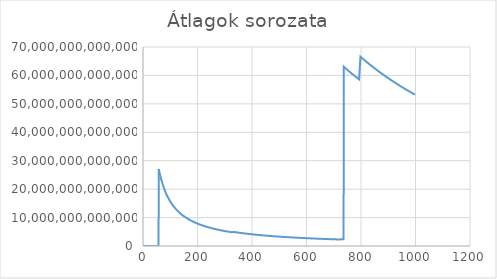
| Category | Series 0 |
|---|---|
| 1.0 | 1.416 |
| 2.0 | 37.728 |
| 3.0 | 2024.991 |
| 4.0 | 1519.695 |
| 5.0 | 1216.106 |
| 6.0 | 2489.924 |
| 7.0 | 2134.746 |
| 8.0 | 1868.083 |
| 9.0 | 1661.159 |
| 10.0 | 1520.624 |
| 11.0 | 555555.229 |
| 12.0 | 509259.933 |
| 13.0 | 470086.574 |
| 14.0 | 437006.24 |
| 15.0 | 407872.583 |
| 16.0 | 382380.632 |
| 17.0 | 359887.732 |
| 18.0 | 1021468.483 |
| 19.0 | 967707.048 |
| 20.0 | 919369.54 |
| 21.0 | 875650.569 |
| 22.0 | 835848.643 |
| 23.0 | 799507.969 |
| 24.0 | 766195.199 |
| 25.0 | 735547.872 |
| 26.0 | 713370.407 |
| 27.0 | 686949.419 |
| 28.0 | 662415.551 |
| 29.0 | 639574.191 |
| 30.0 | 618255.143 |
| 31.0 | 598313.067 |
| 32.0 | 579618.961 |
| 33.0 | 562054.81 |
| 34.0 | 545523.862 |
| 35.0 | 529937.576 |
| 36.0 | 515496.028 |
| 37.0 | 501783.998 |
| 38.0 | 488579.184 |
| 39.0 | 4834120.02 |
| 40.0 | 4713267.061 |
| 41.0 | 4598309.36 |
| 42.0 | 4488825.901 |
| 43.0 | 4384435.829 |
| 44.0 | 4284789.987 |
| 45.0 | 4190022.595 |
| 46.0 | 4099157.76 |
| 47.0 | 4013479.16 |
| 48.0 | 3929865.741 |
| 49.0 | 3849682.39 |
| 50.0 | 3772721.393 |
| 51.0 | 3698765.029 |
| 52.0 | 3627635.266 |
| 53.0 | 3559189.375 |
| 54.0 | 3493278.483 |
| 55.0 | 3429769.534 |
| 56.0 | 3368523.748 |
| 57.0 | 3309426.86 |
| 58.0 | 27010491802150.08 |
| 59.0 | 26552686856388.28 |
| 60.0 | 26110142075473.062 |
| 61.0 | 25682106959487.42 |
| 62.0 | 25267879427882.824 |
| 63.0 | 24866802155581.01 |
| 64.0 | 24478258371900.086 |
| 65.0 | 24101669824731.645 |
| 66.0 | 23736493009205.508 |
| 67.0 | 23382216994142.863 |
| 68.0 | 23038360861876.105 |
| 69.0 | 22704471574022.844 |
| 70.0 | 22380121980108.34 |
| 71.0 | 22064908994473.51 |
| 72.0 | 21758451925107.64 |
| 73.0 | 21460390939832.91 |
| 74.0 | 21170385659135.87 |
| 75.0 | 20888113850347.414 |
| 76.0 | 20613270247053.477 |
| 77.0 | 20345565438650.223 |
| 78.0 | 20084724859653.715 |
| 79.0 | 19830487893073.293 |
| 80.0 | 19582606794410.273 |
| 81.0 | 19340846216701.56 |
| 82.0 | 19104982238449.285 |
| 83.0 | 18874801729628.08 |
| 84.0 | 18650101709037.324 |
| 85.0 | 18430688748335.668 |
| 86.0 | 18216378414906.71 |
| 87.0 | 18006994754968.016 |
| 88.0 | 17802369814573.453 |
| 89.0 | 17602343187443.45 |
| 90.0 | 17406761596570.027 |
| 91.0 | 17215478502103.256 |
| 92.0 | 17028353735776.104 |
| 93.0 | 16845253157972.092 |
| 94.0 | 16666048337142.64 |
| 95.0 | 16490616249383.275 |
| 96.0 | 16318838996785.549 |
| 97.0 | 16150603543210.475 |
| 98.0 | 15985801466239.027 |
| 99.0 | 15824328724155.852 |
| 100.0 | 15666085576246.31 |
| 101.0 | 15510975818226.666 |
| 102.0 | 15358907427851.914 |
| 103.0 | 15209791821763.67 |
| 104.0 | 15063543823479.031 |
| 105.0 | 14920081501350.793 |
| 106.0 | 14779326015496.363 |
| 107.0 | 14641201473295.826 |
| 108.0 | 14505634792988.158 |
| 109.0 | 14372555574712.248 |
| 110.0 | 14241895978578.553 |
| 111.0 | 14113590609572.836 |
| 112.0 | 13987576407702.666 |
| 113.0 | 13863792545687.64 |
| 114.0 | 13742180352164.695 |
| 115.0 | 13622683131711.1 |
| 116.0 | 13505246208161.973 |
| 117.0 | 13389816753391.492 |
| 118.0 | 13276343730057.91 |
| 119.0 | 13164777816360.117 |
| 120.0 | 13055071335175.303 |
| 121.0 | 12947178183644.936 |
| 122.0 | 12841053772306.645 |
| 123.0 | 12736654961149.695 |
| 124.0 | 12633940001785.604 |
| 125.0 | 12532868481771.332 |
| 126.0 | 12433401271601.566 |
| 127.0 | 12335500474233.734 |
| 128.0 | 12239129376790.812 |
| 129.0 | 12144252404877.719 |
| 130.0 | 12050835078686.379 |
| 131.0 | 11958843971215.51 |
| 132.0 | 11868246669850.828 |
| 133.0 | 11779011732483.54 |
| 134.0 | 11691108659853.113 |
| 135.0 | 11604507854965.59 |
| 136.0 | 11519180591326.154 |
| 137.0 | 11435099027858.537 |
| 138.0 | 11352235991425.379 |
| 139.0 | 11270565228897.152 |
| 140.0 | 11190061191547.977 |
| 141.0 | 11110699055438.348 |
| 142.0 | 11032454882080.137 |
| 143.0 | 10955304847939.787 |
| 144.0 | 10879226342051.414 |
| 145.0 | 10804197278356.232 |
| 146.0 | 10730195927134.781 |
| 147.0 | 10657201397018.33 |
| 148.0 | 10585193279470.951 |
| 149.0 | 10514151713837.95 |
| 150.0 | 10444057369260.65 |
| 151.0 | 10441167620137.19 |
| 152.0 | 10372475727899.473 |
| 153.0 | 10304681768894.326 |
| 154.0 | 10237768250914.664 |
| 155.0 | 10171718133167.064 |
| 156.0 | 10106549035579.812 |
| 157.0 | 10042176410045.41 |
| 158.0 | 9978618331500.941 |
| 159.0 | 9915859725649.295 |
| 160.0 | 9853885602364.123 |
| 161.0 | 9792681344260.703 |
| 162.0 | 9732232694002.275 |
| 163.0 | 9672525748165.984 |
| 164.0 | 9613546932649.74 |
| 165.0 | 9555283011846.084 |
| 166.0 | 9497721065991.646 |
| 167.0 | 9440848484763.32 |
| 168.0 | 9384652958068.365 |
| 169.0 | 9329122467192.32 |
| 170.0 | 9274245276208.863 |
| 171.0 | 9220009923720.895 |
| 172.0 | 9166405214862.105 |
| 173.0 | 9113420213620.17 |
| 174.0 | 9061044235380.98 |
| 175.0 | 9009266839750.248 |
| 176.0 | 8958077823615.314 |
| 177.0 | 8907467214442.354 |
| 178.0 | 8860855421693.312 |
| 179.0 | 8811353436097.574 |
| 180.0 | 8762401472563.739 |
| 181.0 | 8713990414706.937 |
| 182.0 | 8666111346494.276 |
| 183.0 | 8618755546786.671 |
| 184.0 | 8571914484032.441 |
| 185.0 | 8525579811146.88 |
| 186.0 | 8479743360549.325 |
| 187.0 | 8434397139369.932 |
| 188.0 | 8389533324798.934 |
| 189.0 | 8345144259589.183 |
| 190.0 | 8301222447696.731 |
| 191.0 | 8257760550704.149 |
| 192.0 | 8214751381169.238 |
| 193.0 | 8172187902510.356 |
| 194.0 | 8130063222600.518 |
| 195.0 | 8088370590689.873 |
| 196.0 | 8047103393799.117 |
| 197.0 | 8006255153343.896 |
| 198.0 | 7965819521256.436 |
| 199.0 | 7925790277748.728 |
| 200.0 | 7886161326580.6 |
| 201.0 | 7846926693115.054 |
| 202.0 | 7808080521366.971 |
| 203.0 | 7769617070522.807 |
| 204.0 | 7731530712333.98 |
| 205.0 | 7693888261300.447 |
| 206.0 | 7656539289171.972 |
| 207.0 | 7619551176663.908 |
| 208.0 | 7582918721626.432 |
| 209.0 | 7546636813874.453 |
| 210.0 | 7510701605770.669 |
| 211.0 | 7475105864296.935 |
| 212.0 | 7439845931171.581 |
| 213.0 | 7404918534940.763 |
| 214.0 | 7370316111880.303 |
| 215.0 | 7336035571825.447 |
| 216.0 | 7302072444178.132 |
| 217.0 | 7268422340748.77 |
| 218.0 | 7235080953874.23 |
| 219.0 | 7202044054541.488 |
| 220.0 | 7169307490657.228 |
| 221.0 | 7136867185269.651 |
| 222.0 | 7104719134885.56 |
| 223.0 | 7072859407823.32 |
| 224.0 | 7041284142610.351 |
| 225.0 | 7009989546421.577 |
| 226.0 | 6978971893561.348 |
| 227.0 | 6948227523986.37 |
| 228.0 | 6917752841863.767 |
| 229.0 | 6887544314430.607 |
| 230.0 | 6857598469585.594 |
| 231.0 | 6827911896149.867 |
| 232.0 | 6798481241425.125 |
| 233.0 | 6769303210346.239 |
| 234.0 | 6740374564148.185 |
| 235.0 | 6711692119194.728 |
| 236.0 | 6683252745808.334 |
| 237.0 | 6655053367134.105 |
| 238.0 | 6627090958028.599 |
| 239.0 | 6599362543978.341 |
| 240.0 | 6571865200045.109 |
| 241.0 | 6544596049837.513 |
| 242.0 | 6517552264529.609 |
| 243.0 | 6490731061795.309 |
| 244.0 | 6464129704984.676 |
| 245.0 | 6437745502107.392 |
| 246.0 | 6411575804945.107 |
| 247.0 | 6385618008196.903 |
| 248.0 | 6359869548487.691 |
| 249.0 | 6334327903726.287 |
| 250.0 | 6308990598672.82 |
| 251.0 | 6283855178023.816 |
| 252.0 | 6258919244777.88 |
| 253.0 | 6234180433533.844 |
| 254.0 | 6209636416078.991 |
| 255.0 | 6185284900721.829 |
| 256.0 | 6161123631578.509 |
| 257.0 | 6137150387875.972 |
| 258.0 | 6113362983271.819 |
| 259.0 | 6089759265189.973 |
| 260.0 | 6066337114170.061 |
| 261.0 | 6043094443234.558 |
| 262.0 | 6020030445645.452 |
| 263.0 | 5997140596328.514 |
| 264.0 | 5974424154703.748 |
| 265.0 | 5951879157893.59 |
| 266.0 | 5929503672337.616 |
| 267.0 | 5907295793808.364 |
| 268.0 | 5885253645324.013 |
| 269.0 | 5863375378985.099 |
| 270.0 | 5841659280994.86 |
| 271.0 | 5820103342962.597 |
| 272.0 | 5798708977919.588 |
| 273.0 | 5777468285692.887 |
| 274.0 | 5756382637714.553 |
| 275.0 | 5735450337213.78 |
| 276.0 | 5714669720051.856 |
| 277.0 | 5694039143445.487 |
| 278.0 | 5673556988256.538 |
| 279.0 | 5653221658631.238 |
| 280.0 | 5633031581279.726 |
| 281.0 | 5612985205545.691 |
| 282.0 | 5593081002689.162 |
| 283.0 | 5573317465577.257 |
| 284.0 | 5553693108304.112 |
| 285.0 | 5534206465818.896 |
| 286.0 | 5514856093560.797 |
| 287.0 | 5495640567102.473 |
| 288.0 | 5476558481805.159 |
| 289.0 | 5457608452456.458 |
| 290.0 | 5438789112967.037 |
| 291.0 | 5420099116016.036 |
| 292.0 | 5401537132743.815 |
| 293.0 | 5383101852427.463 |
| 294.0 | 5364791982183.553 |
| 295.0 | 5346606246651.277 |
| 296.0 | 5328543387709.893 |
| 297.0 | 5310719562124.483 |
| 298.0 | 5292898355540.94 |
| 299.0 | 5275196354413.646 |
| 300.0 | 5257612366565.612 |
| 301.0 | 5240145215846.138 |
| 302.0 | 5222793741621.725 |
| 303.0 | 5205556800759.338 |
| 304.0 | 5188433258651.868 |
| 305.0 | 5171422002066.132 |
| 306.0 | 5154521930163.976 |
| 307.0 | 5137731956450.292 |
| 308.0 | 5121051008539.743 |
| 309.0 | 5104478027977.163 |
| 310.0 | 5088011969831.754 |
| 311.0 | 5071651802726.708 |
| 312.0 | 5055396508487.266 |
| 313.0 | 5039245081942.985 |
| 314.0 | 5023196530732.246 |
| 315.0 | 5007249875079.134 |
| 316.0 | 4991404147626.936 |
| 317.0 | 4975658393218.025 |
| 318.0 | 4960011668711.091 |
| 319.0 | 4944463197000.408 |
| 320.0 | 4929011749510.349 |
| 321.0 | 4913656572723.065 |
| 322.0 | 4898396769702.605 |
| 323.0 | 4883231454626.262 |
| 324.0 | 4868159752605.814 |
| 325.0 | 4853180799520.876 |
| 326.0 | 4838293741853.641 |
| 327.0 | 4823497736527.238 |
| 328.0 | 4808791950757.21 |
| 329.0 | 5008924710586.288 |
| 330.0 | 4993746150960.895 |
| 331.0 | 4978659304583.472 |
| 332.0 | 4963665436361.604 |
| 333.0 | 4948759534150.318 |
| 334.0 | 4933942888839.16 |
| 335.0 | 4919214701111.664 |
| 336.0 | 4904574181167.909 |
| 337.0 | 4890020548582.884 |
| 338.0 | 4875553033381.763 |
| 339.0 | 4861170871041.422 |
| 340.0 | 4846873309656.013 |
| 341.0 | 4832659605012.562 |
| 342.0 | 4818529021402.827 |
| 343.0 | 4804480831836.061 |
| 344.0 | 4790514317790.151 |
| 345.0 | 4776628769042.939 |
| 346.0 | 4762823483583.309 |
| 347.0 | 4749097767492.304 |
| 348.0 | 4735450934827.159 |
| 349.0 | 4721882307507.065 |
| 350.0 | 4708391215199.908 |
| 351.0 | 4694976995213.588 |
| 352.0 | 4681638992404.462 |
| 353.0 | 4668376558998.228 |
| 354.0 | 4655189054595.153 |
| 355.0 | 4642075846051.933 |
| 356.0 | 4629036307158.565 |
| 357.0 | 4616069818903.31 |
| 358.0 | 4603175769131.05 |
| 359.0 | 4590353553492.511 |
| 360.0 | 4577602905657.286 |
| 361.0 | 4564922912950.683 |
| 362.0 | 4552312628660.768 |
| 363.0 | 4539771822538.369 |
| 364.0 | 4527299921927.103 |
| 365.0 | 4514896360884.782 |
| 366.0 | 4502560578477.997 |
| 367.0 | 4490292021043.466 |
| 368.0 | 4478090140551.908 |
| 369.0 | 4465954394913.562 |
| 370.0 | 4453884247901.8 |
| 371.0 | 4441879169066.488 |
| 372.0 | 4429938633665.782 |
| 373.0 | 4418062122583.591 |
| 374.0 | 4406249122255.83 |
| 375.0 | 4394499124650.672 |
| 376.0 | 4382811626988.582 |
| 377.0 | 4371186131956.786 |
| 378.0 | 4359622147480.713 |
| 379.0 | 4348119186669.424 |
| 380.0 | 4336676767757.152 |
| 381.0 | 4325294414036.1 |
| 382.0 | 4313971654209.876 |
| 383.0 | 4302708020647.974 |
| 384.0 | 4291503051844.208 |
| 385.0 | 4280356290670.59 |
| 386.0 | 4269267284740.56 |
| 387.0 | 4258235586330.38 |
| 388.0 | 4247260752345.004 |
| 389.0 | 4236342344242.425 |
| 390.0 | 4225479927975.162 |
| 391.0 | 4214673073939.424 |
| 392.0 | 4203921356919.88 |
| 393.0 | 4193224356012.131 |
| 394.0 | 4182581654601.738 |
| 395.0 | 4171992840286.31 |
| 396.0 | 4161457504831.046 |
| 397.0 | 4150975244113.594 |
| 398.0 | 4140545658074.556 |
| 399.0 | 4130168350661.496 |
| 400.0 | 4119842929785.437 |
| 401.0 | 4109569007267.454 |
| 402.0 | 4099346199314.71 |
| 403.0 | 4089174124380.16 |
| 404.0 | 4079052406250.528 |
| 405.0 | 4068980671921.002 |
| 406.0 | 4058958552039.476 |
| 407.0 | 4048985680904.262 |
| 408.0 | 4039061696392.27 |
| 409.0 | 4029186239921.876 |
| 410.0 | 4019359060605.15 |
| 411.0 | 4009579598170.807 |
| 412.0 | 4000021514820.904 |
| 413.0 | 3990336232702.738 |
| 414.0 | 3980697739394.516 |
| 415.0 | 3971105696649.038 |
| 416.0 | 3961559769493.68 |
| 417.0 | 3952059626161.618 |
| 418.0 | 3942604938060.756 |
| 419.0 | 3933195379740.588 |
| 420.0 | 3923830628836.456 |
| 421.0 | 3914510366062.152 |
| 422.0 | 3905234275178.356 |
| 423.0 | 3896002042849.39 |
| 424.0 | 3886813358882.39 |
| 425.0 | 3877667915685.028 |
| 426.0 | 3868565433381.236 |
| 427.0 | 3859505561171.917 |
| 428.0 | 3850488024827.164 |
| 429.0 | 3841512528265.808 |
| 430.0 | 3832578778200.138 |
| 431.0 | 3823686600464.562 |
| 432.0 | 3814835474084.712 |
| 433.0 | 3806025230495.66 |
| 434.0 | 3797255587108.921 |
| 435.0 | 3788526263920.176 |
| 436.0 | 3779836983498.345 |
| 437.0 | 3771187470950.296 |
| 438.0 | 3762577453893.339 |
| 439.0 | 3754006662426.619 |
| 440.0 | 3745474829103.038 |
| 441.0 | 3736981688902.551 |
| 442.0 | 3728526979199.462 |
| 443.0 | 3720110439799.535 |
| 444.0 | 3711731812683.404 |
| 445.0 | 3703390842317.838 |
| 446.0 | 3695087275406.818 |
| 447.0 | 3686820860920.476 |
| 448.0 | 3678591350070.302 |
| 449.0 | 3670398496283.958 |
| 450.0 | 3662242055606.864 |
| 451.0 | 3654121784973.592 |
| 452.0 | 3646037444741.361 |
| 453.0 | 3637988796960.826 |
| 454.0 | 3629975605780.658 |
| 455.0 | 3621997637416.313 |
| 456.0 | 3614054660142.178 |
| 457.0 | 3606146444255.764 |
| 458.0 | 3598272762063.072 |
| 459.0 | 3590433387858.188 |
| 460.0 | 3582628097884.592 |
| 461.0 | 3574856671556.765 |
| 462.0 | 3567118886553.977 |
| 463.0 | 3559414526107.86 |
| 464.0 | 3551775423017.482 |
| 465.0 | 3544137196301.592 |
| 466.0 | 3536531751881.826 |
| 467.0 | 3528958878751.566 |
| 468.0 | 3521418368326.954 |
| 469.0 | 3513910013597.052 |
| 470.0 | 3506433609312.806 |
| 471.0 | 3498988951968.216 |
| 472.0 | 3491575839785.34 |
| 473.0 | 3484194072682.66 |
| 474.0 | 3476843452286.563 |
| 475.0 | 3469523781861.01 |
| 476.0 | 3462234866352.91 |
| 477.0 | 3454976512335.712 |
| 478.0 | 3447748528002.23 |
| 479.0 | 3440550723142.624 |
| 480.0 | 3433382909172.958 |
| 481.0 | 3426244898966.78 |
| 482.0 | 3419136507060.221 |
| 483.0 | 3412057549488.706 |
| 484.0 | 3405007843807.963 |
| 485.0 | 3397987209208.404 |
| 486.0 | 3390995465979.581 |
| 487.0 | 3384032436275.317 |
| 488.0 | 3377097943578.042 |
| 489.0 | 3370191812882.132 |
| 490.0 | 3363313870406.868 |
| 491.0 | 3356463943990.563 |
| 492.0 | 3349641862803.593 |
| 493.0 | 3342847457402.372 |
| 494.0 | 3336080559715.329 |
| 495.0 | 3329341003029.062 |
| 496.0 | 3322628621974.573 |
| 497.0 | 3315943252513.862 |
| 498.0 | 3309284731926.494 |
| 499.0 | 3302652898796.386 |
| 500.0 | 3296047592998.8 |
| 501.0 | 3289468655687.44 |
| 502.0 | 3282915929281.69 |
| 503.0 | 3276389257454.104 |
| 504.0 | 3269888485117.936 |
| 505.0 | 3263413458515.152 |
| 506.0 | 3256964024802.676 |
| 507.0 | 3250540032650.22 |
| 508.0 | 3244141331798.578 |
| 509.0 | 3237767773189.949 |
| 510.0 | 3231419208928.802 |
| 511.0 | 3225095492278.38 |
| 512.0 | 3218796477645.026 |
| 513.0 | 3212522020573.668 |
| 514.0 | 3206271984319.25 |
| 515.0 | 3200046213475.916 |
| 516.0 | 3193844573527.402 |
| 517.0 | 3187666924452.629 |
| 518.0 | 3181513127306.568 |
| 519.0 | 3175383044209.64 |
| 520.0 | 3169276538355.393 |
| 521.0 | 3163193473983.078 |
| 522.0 | 3157133716370.095 |
| 523.0 | 3151097131826.383 |
| 524.0 | 3145083587682.08 |
| 525.0 | 3139092952276.994 |
| 526.0 | 3133125094959.651 |
| 527.0 | 3127179886050.89 |
| 528.0 | 3121257197008.852 |
| 529.0 | 3115356899850.056 |
| 530.0 | 3109479511412.507 |
| 531.0 | 3103623617794.038 |
| 532.0 | 3097789738813.232 |
| 533.0 | 3091977820237.066 |
| 534.0 | 3086187599599.933 |
| 535.0 | 3080419024647.89 |
| 536.0 | 3074671974228.776 |
| 537.0 | 3068946328095.362 |
| 538.0 | 3063241966890.738 |
| 539.0 | 3057558772146.982 |
| 540.0 | 3051897620367.345 |
| 541.0 | 3046256427016.02 |
| 542.0 | 3040636027885.726 |
| 543.0 | 3035036329860.158 |
| 544.0 | 3029457218959.692 |
| 545.0 | 3023898581860.746 |
| 546.0 | 3018360306069.982 |
| 547.0 | 3012842279916.302 |
| 548.0 | 3007344392548.838 |
| 549.0 | 3001866533910.641 |
| 550.0 | 2996408594758.079 |
| 551.0 | 2990970466636.955 |
| 552.0 | 2985552041894.073 |
| 553.0 | 2980153213608.594 |
| 554.0 | 2974773926375.954 |
| 555.0 | 2969413973355.486 |
| 556.0 | 2964073300742.642 |
| 557.0 | 2958751804694.538 |
| 558.0 | 2953449382105.541 |
| 559.0 | 2948165930621.955 |
| 560.0 | 2942901348605.662 |
| 561.0 | 2937655535150.537 |
| 562.0 | 2932428390105.035 |
| 563.0 | 2927219813923.722 |
| 564.0 | 2922029707870.67 |
| 565.0 | 2916857973896.208 |
| 566.0 | 2911704514578.406 |
| 567.0 | 2906569233248.002 |
| 568.0 | 2901452033904.288 |
| 569.0 | 2896352821190.962 |
| 570.0 | 2891271500572.318 |
| 571.0 | 2886207978016.244 |
| 572.0 | 2881162159872.868 |
| 573.0 | 2876133953661.146 |
| 574.0 | 2877246143592.568 |
| 575.0 | 2872242237255.888 |
| 576.0 | 2867255705593.988 |
| 577.0 | 2862286458275.474 |
| 578.0 | 2857334405579.53 |
| 579.0 | 2852399458419.643 |
| 580.0 | 2847481528318.921 |
| 581.0 | 2842580527572.623 |
| 582.0 | 2837696368590.542 |
| 583.0 | 2832828964870.946 |
| 584.0 | 2827978230342.062 |
| 585.0 | 2823144079520.981 |
| 586.0 | 2818326427508.148 |
| 587.0 | 2813525189982.584 |
| 588.0 | 2808740283196.904 |
| 589.0 | 2803971623972.468 |
| 590.0 | 2799219129694.589 |
| 591.0 | 2794482718307.629 |
| 592.0 | 2789762308310.49 |
| 593.0 | 2785057822186.05 |
| 594.0 | 2780369172653.754 |
| 595.0 | 2775696283287.962 |
| 596.0 | 2771039074758.961 |
| 597.0 | 2766397468268.616 |
| 598.0 | 2761771385546.114 |
| 599.0 | 2757160748842.544 |
| 600.0 | 2752565480927.808 |
| 601.0 | 2747985505086 |
| 602.0 | 2743420745110.777 |
| 603.0 | 2738871125301.34 |
| 604.0 | 2734336570458.13 |
| 605.0 | 2729817005879.786 |
| 606.0 | 2725312357355.928 |
| 607.0 | 2720822551534.068 |
| 608.0 | 2716347514442.736 |
| 609.0 | 2711887173697.334 |
| 610.0 | 2707441457019.168 |
| 611.0 | 2703010292605.122 |
| 612.0 | 2698593609120.477 |
| 613.0 | 2694191335696.214 |
| 614.0 | 2689803401924.725 |
| 615.0 | 2685429737856.644 |
| 616.0 | 2681070273997.58 |
| 617.0 | 2676724941300.776 |
| 618.0 | 2672393671169.232 |
| 619.0 | 2668076399575.354 |
| 620.0 | 2663773050587.76 |
| 621.0 | 2659483560973.289 |
| 622.0 | 2655207863930.914 |
| 623.0 | 2650945893041.782 |
| 624.0 | 2646697582315.77 |
| 625.0 | 2642462866184.154 |
| 626.0 | 2638241685416.608 |
| 627.0 | 2634033963430.384 |
| 628.0 | 2629839641836.721 |
| 629.0 | 2625658656714.597 |
| 630.0 | 2621490944561.089 |
| 631.0 | 2617336442276.258 |
| 632.0 | 2613195087147.113 |
| 633.0 | 2609066816867.267 |
| 634.0 | 2604951569522.148 |
| 635.0 | 2600849283585.895 |
| 636.0 | 2596759897928.677 |
| 637.0 | 2592683351778.104 |
| 638.0 | 2588619584769.709 |
| 639.0 | 2584568536906.224 |
| 640.0 | 2580530148567.891 |
| 641.0 | 2576504360504.61 |
| 642.0 | 2572491113840.964 |
| 643.0 | 2568505247183.262 |
| 644.0 | 2564516885021.648 |
| 645.0 | 2560540889851.08 |
| 646.0 | 2556577204263.078 |
| 647.0 | 2552625771180.766 |
| 648.0 | 2548686533879.567 |
| 649.0 | 2544759435984.531 |
| 650.0 | 2540844421467.668 |
| 651.0 | 2536941434645.139 |
| 652.0 | 2533050442793.319 |
| 653.0 | 2529171345642.596 |
| 654.0 | 2525304111198.21 |
| 655.0 | 2521448685074.256 |
| 656.0 | 2517605013298.233 |
| 657.0 | 2513773042781.018 |
| 658.0 | 2509952719363.859 |
| 659.0 | 2506143989895.936 |
| 660.0 | 2502346802032.534 |
| 661.0 | 2498561103391.062 |
| 662.0 | 2494786841905.581 |
| 663.0 | 2491023965824.286 |
| 664.0 | 2487272423707.154 |
| 665.0 | 2483532164423.408 |
| 666.0 | 2479803137230.918 |
| 667.0 | 2476085291448.238 |
| 668.0 | 2472378585996.366 |
| 669.0 | 2468682952833.446 |
| 670.0 | 2464998351412.061 |
| 671.0 | 2461324732408.484 |
| 672.0 | 2457662046796.389 |
| 673.0 | 2454010245835.333 |
| 674.0 | 2450369281079.174 |
| 675.0 | 2446739104366.544 |
| 676.0 | 2443119667821.628 |
| 677.0 | 2439510923851.482 |
| 678.0 | 2435912825143.746 |
| 679.0 | 2432325324664.931 |
| 680.0 | 2428748375658.072 |
| 681.0 | 2425181931640.956 |
| 682.0 | 2421625946414.631 |
| 683.0 | 2418080374349.852 |
| 684.0 | 2414545169124.808 |
| 685.0 | 2411020285666.236 |
| 686.0 | 2407505678869.074 |
| 687.0 | 2404001303790.665 |
| 688.0 | 2400507117427.809 |
| 689.0 | 2397023072264.694 |
| 690.0 | 2393549125790.692 |
| 691.0 | 2390085234147.004 |
| 692.0 | 2386631353750.854 |
| 693.0 | 2383187441263.486 |
| 694.0 | 2379753453599.55 |
| 695.0 | 2376329347910.92 |
| 696.0 | 2372915081606.454 |
| 697.0 | 2369510612336.22 |
| 698.0 | 2366115897991.956 |
| 699.0 | 2362730896707.298 |
| 700.0 | 2359355566854.862 |
| 701.0 | 2355989867044.824 |
| 702.0 | 2352633756124.963 |
| 703.0 | 2349287193405.54 |
| 704.0 | 2345950137733.092 |
| 705.0 | 2342622548886.676 |
| 706.0 | 2339304386636.134 |
| 707.0 | 2335995610986.454 |
| 708.0 | 2332696182158.493 |
| 709.0 | 2329406060604.182 |
| 710.0 | 2326125206997.707 |
| 711.0 | 2322853582237.551 |
| 712.0 | 2319591147431.051 |
| 713.0 | 2316337863914.32 |
| 714.0 | 2313093693236.574 |
| 715.0 | 2309858597162.121 |
| 716.0 | 2306632537668.882 |
| 717.0 | 2303415476946.891 |
| 718.0 | 2300207377397.08 |
| 719.0 | 2297008201629.008 |
| 720.0 | 2293817912461.056 |
| 721.0 | 2290636472915.36 |
| 722.0 | 2287463846221.973 |
| 723.0 | 2284299995812.326 |
| 724.0 | 2281144885320.978 |
| 725.0 | 2277998478582.88 |
| 726.0 | 2274860739631.914 |
| 727.0 | 2271731632706.313 |
| 728.0 | 2413176270008.65 |
| 729.0 | 2409866014494.472 |
| 730.0 | 2406564828327.747 |
| 731.0 | 2403272740591.302 |
| 732.0 | 2399989581109.729 |
| 733.0 | 2396715379771.245 |
| 734.0 | 2393450099964.828 |
| 735.0 | 2390193705808.01 |
| 736.0 | 2386946160012.094 |
| 737.0 | 63060942606410.445 |
| 738.0 | 62975494308324.055 |
| 739.0 | 62890277130640.26 |
| 740.0 | 62805290269652.91 |
| 741.0 | 62720532792918.31 |
| 742.0 | 62636003772981.78 |
| 743.0 | 62551702288680.35 |
| 744.0 | 62467627420012.77 |
| 745.0 | 62383778255690.62 |
| 746.0 | 62300153888055.65 |
| 747.0 | 62216753638677.64 |
| 748.0 | 62133576160904.516 |
| 749.0 | 62050620785522.81 |
| 750.0 | 61967886624475.445 |
| 751.0 | 61885372794743.03 |
| 752.0 | 61803078416026.76 |
| 753.0 | 61721002614677.46 |
| 754.0 | 61639144521024.055 |
| 755.0 | 61557503270002.91 |
| 756.0 | 61476078001127.234 |
| 757.0 | 61394867858457.34 |
| 758.0 | 61313872068027.734 |
| 759.0 | 61233089627885.43 |
| 760.0 | 61152519773113.64 |
| 761.0 | 61072161665658.83 |
| 762.0 | 60992014471871.9 |
| 763.0 | 60912077362472.47 |
| 764.0 | 60832349512521.61 |
| 765.0 | 60752830101394.13 |
| 766.0 | 60673518312750.02 |
| 767.0 | 60594413334506.555 |
| 768.0 | 60515514358810.66 |
| 769.0 | 60436820582011.17 |
| 770.0 | 60358331204633.16 |
| 771.0 | 60280045431345.78 |
| 772.0 | 60201962470945.375 |
| 773.0 | 60124081536312.86 |
| 774.0 | 60046401844406.586 |
| 775.0 | 59968922616220.25 |
| 776.0 | 59891643087897.64 |
| 777.0 | 59814562466162.89 |
| 778.0 | 59737679995126.695 |
| 779.0 | 59660994911692.65 |
| 780.0 | 59584506456680.984 |
| 781.0 | 59508213874790.26 |
| 782.0 | 59432116414592.46 |
| 783.0 | 59356213328494.695 |
| 784.0 | 59280503872865.42 |
| 785.0 | 59204987307422.29 |
| 786.0 | 59129662896089.7 |
| 787.0 | 59054529906387.01 |
| 788.0 | 58979587609551.49 |
| 789.0 | 58904835280516.08 |
| 790.0 | 58830272197882.59 |
| 791.0 | 58755897643902.98 |
| 792.0 | 58681710904453.625 |
| 793.0 | 58607711269013.266 |
| 794.0 | 58533898030639.94 |
| 795.0 | 58460270485947.805 |
| 796.0 | 63482795500550.4 |
| 797.0 | 63403143310461.89 |
| 798.0 | 66582985128492.44 |
| 799.0 | 66499652230959.92 |
| 800.0 | 66416527665671.23 |
| 801.0 | 66333610652356.03 |
| 802.0 | 66250900414634.89 |
| 803.0 | 66168396179996.516 |
| 804.0 | 66086097179772.66 |
| 805.0 | 66004002649114.555 |
| 806.0 | 65922111826969.27 |
| 807.0 | 65840423956085.94 |
| 808.0 | 65758938282872.96 |
| 809.0 | 65677654057688.18 |
| 810.0 | 65596570534160.18 |
| 811.0 | 65515686970025.25 |
| 812.0 | 65435002626467.29 |
| 813.0 | 65354516768378.17 |
| 814.0 | 65274228664240.12 |
| 815.0 | 65194137588373.586 |
| 816.0 | 65114242811917.24 |
| 817.0 | 65034543616309.02 |
| 818.0 | 64955039284259.99 |
| 819.0 | 64875729101984.77 |
| 820.0 | 64796612359177.48 |
| 821.0 | 64717688348997.2 |
| 822.0 | 64638956368037.35 |
| 823.0 | 64560415716314.35 |
| 824.0 | 64482065697309.305 |
| 825.0 | 64403905617676.195 |
| 826.0 | 64325934787632.31 |
| 827.0 | 64248152520658.17 |
| 828.0 | 64170558133556.3 |
| 829.0 | 64093150946422.96 |
| 830.0 | 64015930282632.086 |
| 831.0 | 63938895468814.234 |
| 832.0 | 63862045834837.3 |
| 833.0 | 63785380713787.086 |
| 834.0 | 63708899441948.05 |
| 835.0 | 63632601358784.04 |
| 836.0 | 63556485806921.17 |
| 837.0 | 63480552132122.734 |
| 838.0 | 63404799683277.93 |
| 839.0 | 63329227812380.11 |
| 840.0 | 63253835874508.25 |
| 841.0 | 63178623227812.95 |
| 842.0 | 63103589238636.32 |
| 843.0 | 63028733262323.9 |
| 844.0 | 62954054668411.85 |
| 845.0 | 62879552828567.586 |
| 846.0 | 62805227116095.87 |
| 847.0 | 62731233910163.12 |
| 848.0 | 62657258398476.6 |
| 849.0 | 62583457151835.29 |
| 850.0 | 62509829555186.08 |
| 851.0 | 62436374996366.83 |
| 852.0 | 62363092866089.46 |
| 853.0 | 62289982557922.914 |
| 854.0 | 62217043468276.65 |
| 855.0 | 62144274996384.06 |
| 856.0 | 62071676544285.53 |
| 857.0 | 61999247516812.62 |
| 858.0 | 61926987321571.58 |
| 859.0 | 61854895368927.51 |
| 860.0 | 61782971071986.984 |
| 861.0 | 61711213846584 |
| 862.0 | 61639623111266.35 |
| 863.0 | 61568198287267.195 |
| 864.0 | 61496938798508.79 |
| 865.0 | 61425844071574.09 |
| 866.0 | 61354913535696.65 |
| 867.0 | 61284241647326.45 |
| 868.0 | 61213637682295.18 |
| 869.0 | 61143196212004.86 |
| 870.0 | 61072916676129 |
| 871.0 | 61002798516916.76 |
| 872.0 | 60934658362764.516 |
| 873.0 | 60864859212291.71 |
| 874.0 | 60795219785280.195 |
| 875.0 | 60725739534137.99 |
| 876.0 | 60656417913665.234 |
| 877.0 | 60587254381266.52 |
| 878.0 | 60518248396777.61 |
| 879.0 | 60449399422492.35 |
| 880.0 | 60380706923148.8 |
| 881.0 | 60312170365914.805 |
| 882.0 | 60243789220375.23 |
| 883.0 | 60175562958517.77 |
| 884.0 | 60107491054718.74 |
| 885.0 | 60039572985731.336 |
| 886.0 | 59971808230669.27 |
| 887.0 | 59904196270995.47 |
| 888.0 | 59836736590510.17 |
| 889.0 | 59769428675335.234 |
| 890.0 | 59702272013902.37 |
| 891.0 | 59635266096939.51 |
| 892.0 | 59568410417458.64 |
| 893.0 | 59501704470742.805 |
| 894.0 | 59435147754332.58 |
| 895.0 | 59368739768014.9 |
| 896.0 | 59302480013809.54 |
| 897.0 | 59236367995956.96 |
| 898.0 | 59170403772703.83 |
| 899.0 | 59104585748485.35 |
| 900.0 | 59038913986542.65 |
| 901.0 | 58973387999876.336 |
| 902.0 | 58908007303645.875 |
| 903.0 | 58842771415159 |
| 904.0 | 58777679853859.05 |
| 905.0 | 58712732141313.35 |
| 906.0 | 58647927801202.67 |
| 907.0 | 58583266359305.05 |
| 908.0 | 58518747343491.734 |
| 909.0 | 58454370283707.914 |
| 910.0 | 58390134711967.6 |
| 911.0 | 58326040164192.56 |
| 912.0 | 58262086172784.47 |
| 913.0 | 58198272282631.78 |
| 914.0 | 58134598024116.875 |
| 915.0 | 58071062944312.09 |
| 916.0 | 58007666587385.99 |
| 917.0 | 57944408499504.44 |
| 918.0 | 57881288228807.86 |
| 919.0 | 57818305325403.34 |
| 920.0 | 57755459341354.086 |
| 921.0 | 57692749830668.6 |
| 922.0 | 57630176349290.71 |
| 923.0 | 57567738455179.89 |
| 924.0 | 57505435707934.02 |
| 925.0 | 57443267669330.86 |
| 926.0 | 57381233902949.31 |
| 927.0 | 57319333974264.17 |
| 928.0 | 57257567450585.24 |
| 929.0 | 57195933901122.83 |
| 930.0 | 57134432896930.44 |
| 931.0 | 57073064013967.39 |
| 932.0 | 57011826820819.375 |
| 933.0 | 56950720897110.03 |
| 934.0 | 56889745821203.055 |
| 935.0 | 56828901173298.516 |
| 936.0 | 56768186535292.92 |
| 937.0 | 56707601490964.99 |
| 938.0 | 56647145625836.08 |
| 939.0 | 56586818527193.02 |
| 940.0 | 56526619784078.99 |
| 941.0 | 56466548987299.73 |
| 942.0 | 56406605729352 |
| 943.0 | 56346789604506.45 |
| 944.0 | 56287100208738.97 |
| 945.0 | 56227537375751.19 |
| 946.0 | 56168100232647.87 |
| 947.0 | 56108788616773.9 |
| 948.0 | 56049602130891.25 |
| 949.0 | 55990540379436.16 |
| 950.0 | 55931602968510.45 |
| 951.0 | 55872789505872.7 |
| 952.0 | 55814099600936.37 |
| 953.0 | 55755532864739.76 |
| 954.0 | 55697088909954.97 |
| 955.0 | 55638767350911.4 |
| 956.0 | 55580567805809.24 |
| 957.0 | 55522489887516.875 |
| 958.0 | 55464533217491.72 |
| 959.0 | 55406697416430.74 |
| 960.0 | 55348982106623.805 |
| 961.0 | 55291386911923.89 |
| 962.0 | 55233911457753.51 |
| 963.0 | 55176555371089.18 |
| 964.0 | 55119318280455.27 |
| 965.0 | 55072472560119.57 |
| 966.0 | 55015461718960.25 |
| 967.0 | 54958568790605.586 |
| 968.0 | 54901793409624.06 |
| 969.0 | 54845135212090.914 |
| 970.0 | 54788593901453.97 |
| 971.0 | 54732168984974.64 |
| 972.0 | 54675860169146.48 |
| 973.0 | 54619667096002.484 |
| 974.0 | 54563589409045.61 |
| 975.0 | 54507626753315.75 |
| 976.0 | 54451778775085.72 |
| 977.0 | 54396045122296.484 |
| 978.0 | 54340430197736.62 |
| 979.0 | 54284924140333.41 |
| 980.0 | 54229531360598.375 |
| 981.0 | 54174251512116.625 |
| 982.0 | 54119084249942.87 |
| 983.0 | 54064029230535.48 |
| 984.0 | 54009086111398.76 |
| 985.0 | 53954254551894.805 |
| 986.0 | 53899534212592.7 |
| 987.0 | 53844924755437.1 |
| 988.0 | 53790425843741.33 |
| 989.0 | 53736037142180.516 |
| 990.0 | 53681758316784.375 |
| 991.0 | 53627589034930.91 |
| 992.0 | 53573528965344.71 |
| 993.0 | 53519577778068.43 |
| 994.0 | 53465735144488.945 |
| 995.0 | 53412000737308.586 |
| 996.0 | 53358374230544.22 |
| 997.0 | 53304855299520.67 |
| 998.0 | 53251443620863.9 |
| 999.0 | 53198138872494.71 |
| 1000.0 | 53144940733650.484 |